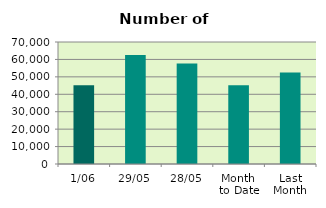
| Category | Series 0 |
|---|---|
| 1/06 | 45238 |
| 29/05 | 62472 |
| 28/05 | 57722 |
| Month 
to Date | 45238 |
| Last
Month | 52506.1 |